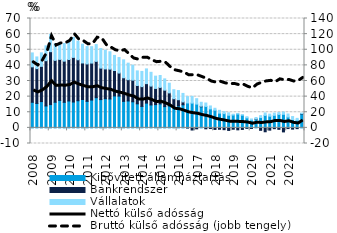
| Category | Kibővített államháztartás | Bankrendszer | Vállalatok |
|---|---|---|---|
| 2008.0 | 16.383 | 22.687 | 8.905 |
| 2008.0 | 15.632 | 22.302 | 7.464 |
| 2008.0 | 16.826 | 22.546 | 8.669 |
| 2008.0 | 14.03 | 28.975 | 9.491 |
| 2009.0 | 14.909 | 33.864 | 11.025 |
| 2009.0 | 16.412 | 26.811 | 10.515 |
| 2009.0 | 17.578 | 26.251 | 10.348 |
| 2009.0 | 16.359 | 26.341 | 11.274 |
| 2010.0 | 17.216 | 26.562 | 11.115 |
| 2010.0 | 16.55 | 28.558 | 12.773 |
| 2010.0 | 17.374 | 26.214 | 11.928 |
| 2010.0 | 18.15 | 23.39 | 12.021 |
| 2011.0 | 16.986 | 23.937 | 11.108 |
| 2011.0 | 17.817 | 23.644 | 10.504 |
| 2011.0 | 19.321 | 23.258 | 10.737 |
| 2011.0 | 18.1 | 20.156 | 12.519 |
| 2012.0 | 18.683 | 19.058 | 11.967 |
| 2012.0 | 18.512 | 19.087 | 11.104 |
| 2012.0 | 20.432 | 16.286 | 9.652 |
| 2012.0 | 20.345 | 14.755 | 9.911 |
| 2013.0 | 16.974 | 15.097 | 11.471 |
| 2013.0 | 17.228 | 13.613 | 10.579 |
| 2013.0 | 16.692 | 13.854 | 9.575 |
| 2013.0 | 15.392 | 11.718 | 9.365 |
| 2014.0 | 13.732 | 12.655 | 9.736 |
| 2014.0 | 15.856 | 12.458 | 9.43 |
| 2014.0 | 14.676 | 12.064 | 8.824 |
| 2014.0 | 14.894 | 10.353 | 7.857 |
| 2015.0 | 15.344 | 10.561 | 7.611 |
| 2015.0 | 13.606 | 10.535 | 7.225 |
| 2015.0 | 14.05 | 8.344 | 6.195 |
| 2015.0 | 12.986 | 5.685 | 5.761 |
| 2016.0 | 14.043 | 3.975 | 5.858 |
| 2016.0 | 14.783 | 1.821 | 5.439 |
| 2016.0 | 15.954 | -0.067 | 4.047 |
| 2016.0 | 15.849 | -1.367 | 4.31 |
| 2017.0 | 15.215 | -0.62 | 3.468 |
| 2017.0 | 13.514 | 0.344 | 2.527 |
| 2017.0 | 13.735 | -0.604 | 2.171 |
| 2017.0 | 12.146 | -0.427 | 1.88 |
| 2018.0 | 11.292 | -0.999 | 1.253 |
| 2018.0 | 9.427 | -0.888 | 1.803 |
| 2018.0 | 9.119 | -1.151 | 1.258 |
| 2018.0 | 8.066 | -1.634 | 1.564 |
| 2019.0 | 8.231 | -0.872 | 0.514 |
| 2019.0 | 8.893 | -1.257 | 0.04 |
| 2019.0 | 8.132 | -1.015 | 0.269 |
| 2019.0 | 6.395 | -0.294 | 0.746 |
| 2020.0 | 5 | -0.371 | 0.688 |
| 2020.0 | 5.539 | 0.137 | 0.971 |
| 2020.0 | 6.595 | -1.564 | 1.212 |
| 2020.0 | 7.996 | -2.495 | 1.529 |
| 2021.0 | 7.472 | -1.442 | 1.326 |
| 2021.0 | 8.004 | -0.52 | 1.429 |
| 2021.0 | 8.615 | -0.942 | 1.197 |
| 2021.0 | 8.674 | -2.575 | 1.467 |
| 2022.0 | 6.948 | -0.447 | 1.942 |
| 2022.0 | 5.372 | -0.815 | 1.872 |
| 2022.0 | 4.903 | -0.491 | 1.186 |
| 2022.0 | 8.876 | 0.247 | 0.325 |